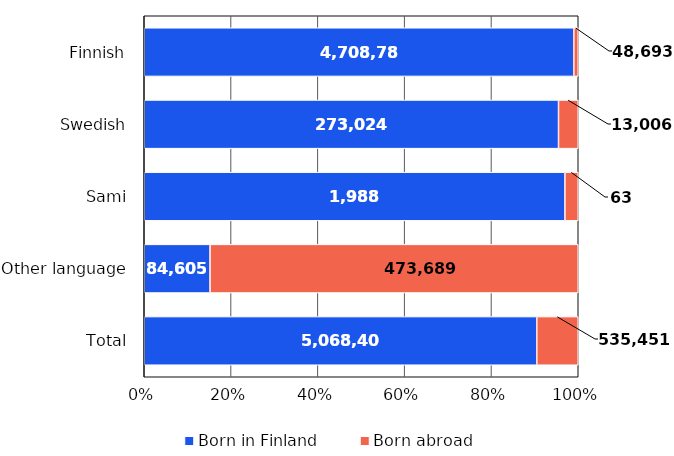
| Category | Born in Finland | Born abroad |
|---|---|---|
| Finnish | 4708783 | 48693 |
| Swedish | 273024 | 13006 |
| Sami | 1988 | 63 |
| Other language | 84605 | 473689 |
| Total | 5068400 | 535451 |